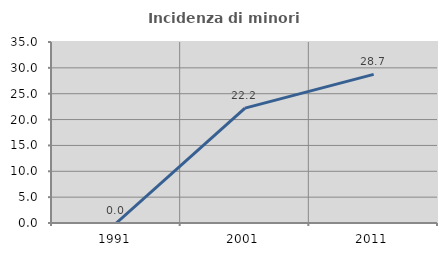
| Category | Incidenza di minori stranieri |
|---|---|
| 1991.0 | 0 |
| 2001.0 | 22.222 |
| 2011.0 | 28.736 |